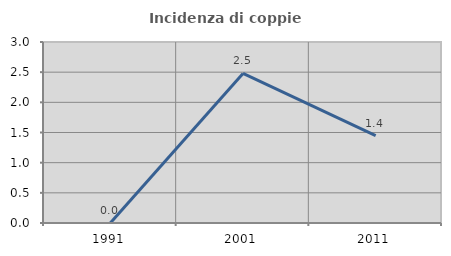
| Category | Incidenza di coppie miste |
|---|---|
| 1991.0 | 0 |
| 2001.0 | 2.479 |
| 2011.0 | 1.449 |